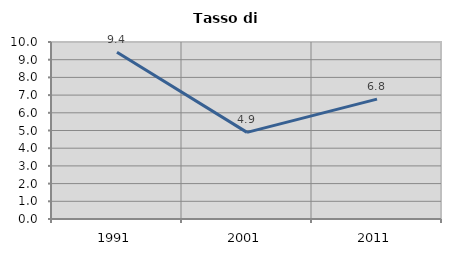
| Category | Tasso di disoccupazione   |
|---|---|
| 1991.0 | 9.423 |
| 2001.0 | 4.895 |
| 2011.0 | 6.771 |